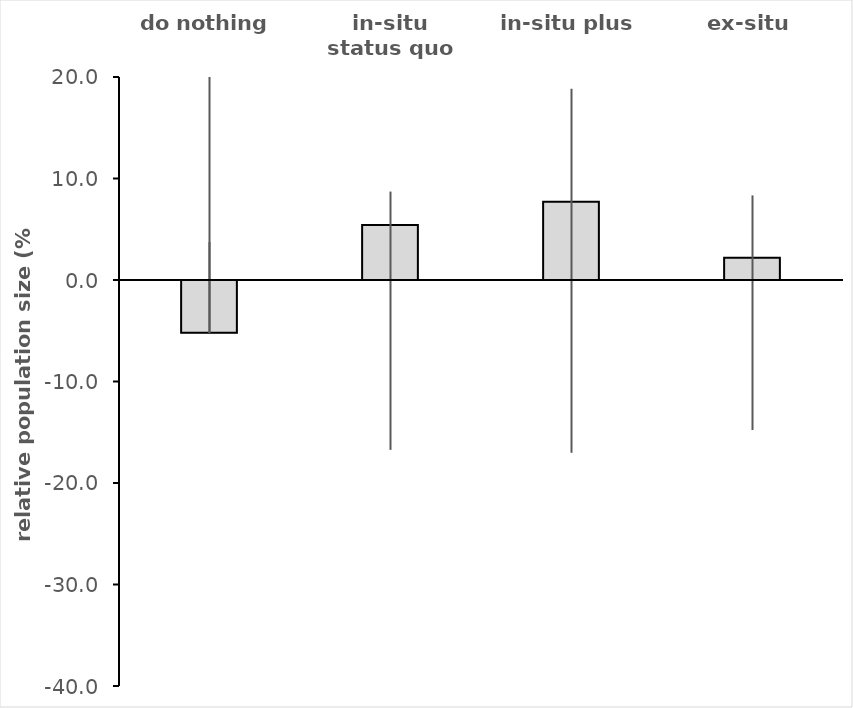
| Category | best estimate |
|---|---|
| do nothing | -5.208 |
| in-situ status quo | 5.425 |
| in-situ plus | 7.698 |
| ex-situ | 2.19 |